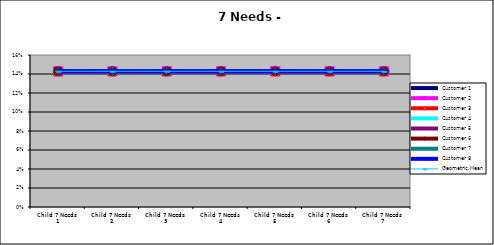
| Category | Customer 1 | Customer 2 | Customer 3 | Customer 4 | Customer 5 | Customer 6 | Customer 7 | Customer 8 | Geometric Mean |
|---|---|---|---|---|---|---|---|---|---|
| Child 7 Needs 1 | 0.143 | 0.143 | 0.143 | 0.143 | 0.143 | 0.143 | 0.143 | 0.143 | 0.143 |
| Child 7 Needs 2 | 0.143 | 0.143 | 0.143 | 0.143 | 0.143 | 0.143 | 0.143 | 0.143 | 0.143 |
| Child 7 Needs 3 | 0.143 | 0.143 | 0.143 | 0.143 | 0.143 | 0.143 | 0.143 | 0.143 | 0.143 |
| Child 7 Needs 4 | 0.143 | 0.143 | 0.143 | 0.143 | 0.143 | 0.143 | 0.143 | 0.143 | 0.143 |
| Child 7 Needs 5 | 0.143 | 0.143 | 0.143 | 0.143 | 0.143 | 0.143 | 0.143 | 0.143 | 0.143 |
| Child 7 Needs 6 | 0.143 | 0.143 | 0.143 | 0.143 | 0.143 | 0.143 | 0.143 | 0.143 | 0.143 |
| Child 7 Needs 7 | 0.143 | 0.143 | 0.143 | 0.143 | 0.143 | 0.143 | 0.143 | 0.143 | 0.143 |